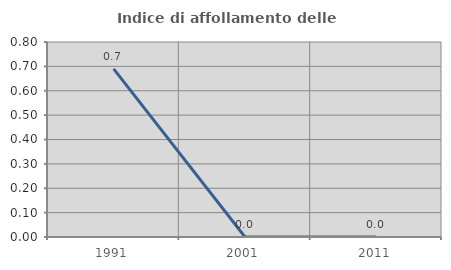
| Category | Indice di affollamento delle abitazioni  |
|---|---|
| 1991.0 | 0.69 |
| 2001.0 | 0 |
| 2011.0 | 0 |